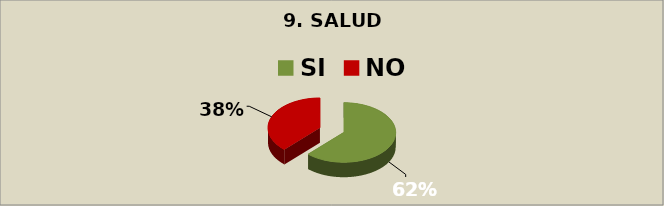
| Category | Series 0 |
|---|---|
| SI | 0.62 |
| NO | 0.38 |